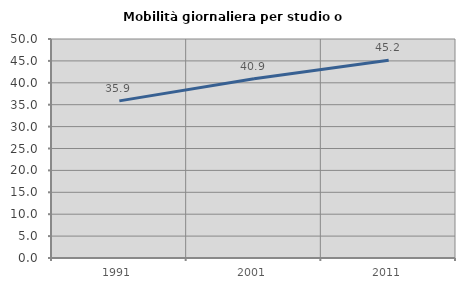
| Category | Mobilità giornaliera per studio o lavoro |
|---|---|
| 1991.0 | 35.87 |
| 2001.0 | 40.909 |
| 2011.0 | 45.153 |